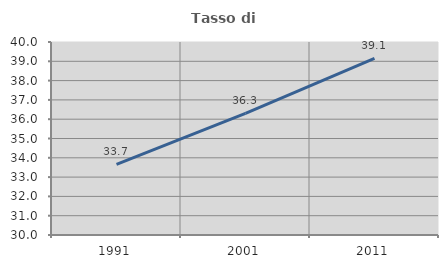
| Category | Tasso di occupazione   |
|---|---|
| 1991.0 | 33.663 |
| 2001.0 | 36.302 |
| 2011.0 | 39.146 |